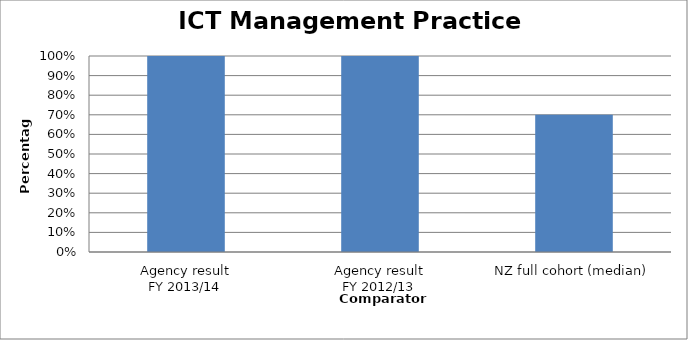
| Category | Result |
|---|---|
| Agency result
FY 2013/14 | 1 |
| Agency result
FY 2012/13 | 1 |
| NZ full cohort (median) | 0.7 |